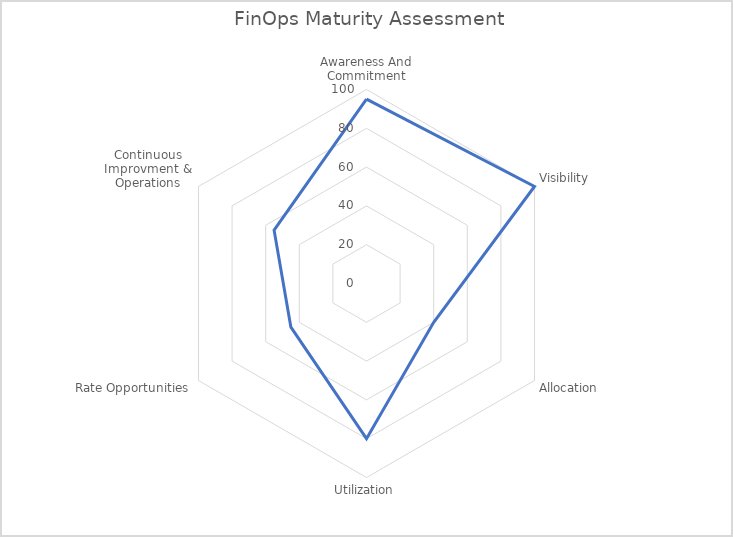
| Category | Series 0 |
|---|---|
| Awareness And Commitment | 95 |
| Visibility | 100 |
| Allocation | 40 |
| Utilization | 80 |
| Rate Opportunities | 45 |
| Continuous Improvment & Operations | 55 |